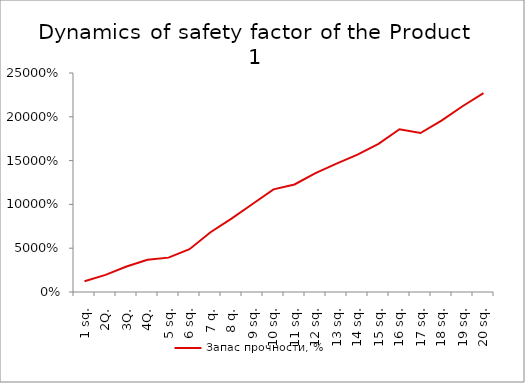
| Category | Запас прочности, % |
|---|---|
| 1 sq. | 12.266 |
| 2Q. | 19.596 |
| 3Q. | 29.049 |
| 4Q. | 36.839 |
| 5 sq. | 39.237 |
| 6 sq. | 48.86 |
| 7 q. | 68.173 |
| 8 q. | 83.852 |
| 9 sq. | 100.422 |
| 10 sq. | 117.122 |
| 11 sq. | 122.738 |
| 12 sq. | 135.819 |
| 13 sq. | 146.466 |
| 14 sq. | 156.752 |
| 15 sq. | 169.2 |
| 16 sq. | 185.737 |
| 17 sq. | 181.456 |
| 18 sq. | 195.73 |
| 19 sq. | 212.081 |
| 20 sq. | 226.977 |